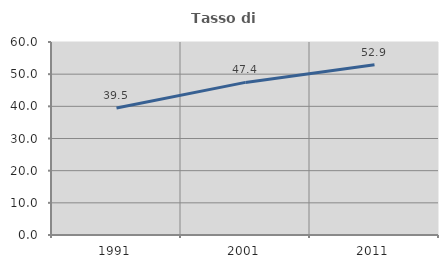
| Category | Tasso di occupazione   |
|---|---|
| 1991.0 | 39.468 |
| 2001.0 | 47.443 |
| 2011.0 | 52.938 |